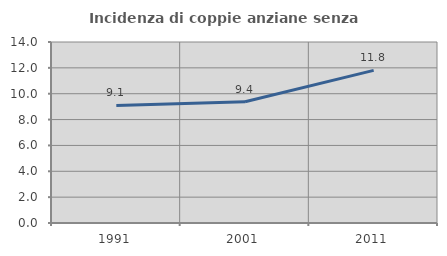
| Category | Incidenza di coppie anziane senza figli  |
|---|---|
| 1991.0 | 9.091 |
| 2001.0 | 9.375 |
| 2011.0 | 11.806 |